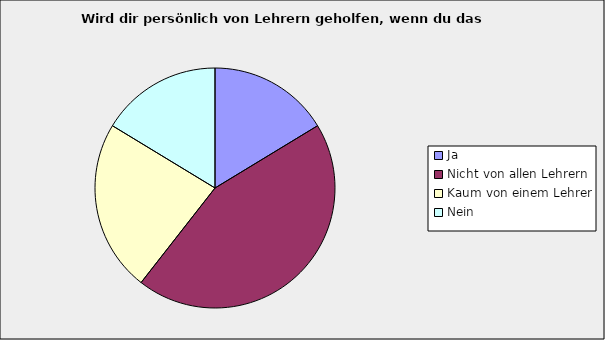
| Category | Series 0 |
|---|---|
| Ja | 0.163 |
| Nicht von allen Lehrern | 0.442 |
| Kaum von einem Lehrer | 0.231 |
| Nein | 0.163 |